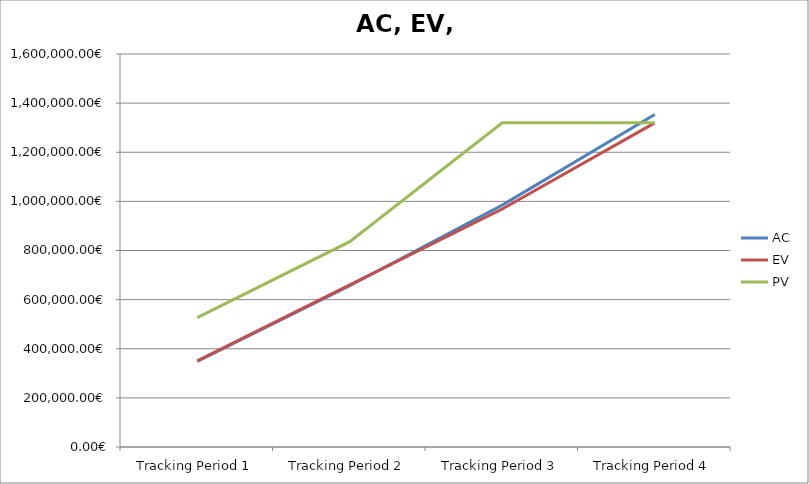
| Category | AC | EV | PV |
|---|---|---|---|
| Tracking Period 1 | 348020.945 | 350722.945 | 526935.715 |
| Tracking Period 2 | 656604.146 | 659868.146 | 836080.916 |
| Tracking Period 3 | 984866.347 | 969013.347 | 1319736.291 |
| Tracking Period 4 | 1353361.291 | 1319736.291 | 1319736.291 |